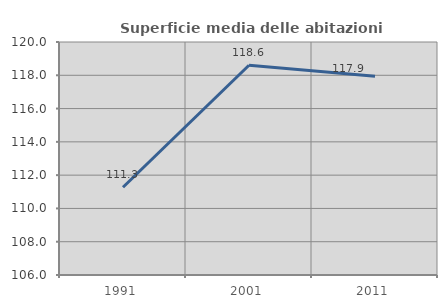
| Category | Superficie media delle abitazioni occupate |
|---|---|
| 1991.0 | 111.272 |
| 2001.0 | 118.605 |
| 2011.0 | 117.939 |